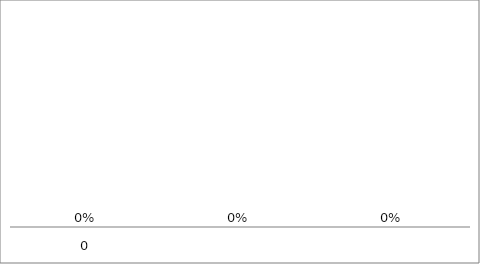
| Category | Series 0 |
|---|---|
| 0 | 0 |